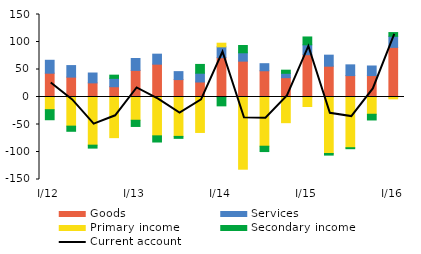
| Category | Goods | Services | Primary income | Secondary income |
|---|---|---|---|---|
| I/12 | 43.281 | 23.478 | -23.083 | -18.258 |
| II | 36.152 | 20.972 | -52.981 | -9.36 |
| III | 25.681 | 17.923 | -87.565 | -5.364 |
| IV | 18.683 | 15.252 | -73.899 | 5.772 |
| I/13 | 48.355 | 21.702 | -42.281 | -11.28 |
| II | 59.692 | 18.186 | -70.624 | -11.218 |
| III | 31.672 | 14.458 | -71.638 | -3.56 |
| IV | 27.254 | 16.013 | -64.475 | 15.96 |
| I/14 | 71.525 | 19.636 | 6.653 | -16.093 |
| II | 65.182 | 15.226 | -131.27 | 13.191 |
| III | 47.73 | 12.825 | -89.485 | -9.728 |
| IV | 35.101 | 7.964 | -46.676 | 5.699 |
| I/15 | 76.87 | 18.007 | -17.262 | 14.268 |
| II | 56.045 | 20.023 | -102.674 | -2.957 |
| III | 38.874 | 19.58 | -92.216 | -1.788 |
| IV | 38.938 | 17.433 | -31.364 | -10.405 |
| I/16 | 90.264 | 20.096 | -3.34 | 6.786 |